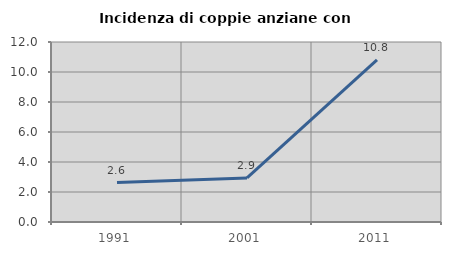
| Category | Incidenza di coppie anziane con figli |
|---|---|
| 1991.0 | 2.632 |
| 2001.0 | 2.941 |
| 2011.0 | 10.811 |